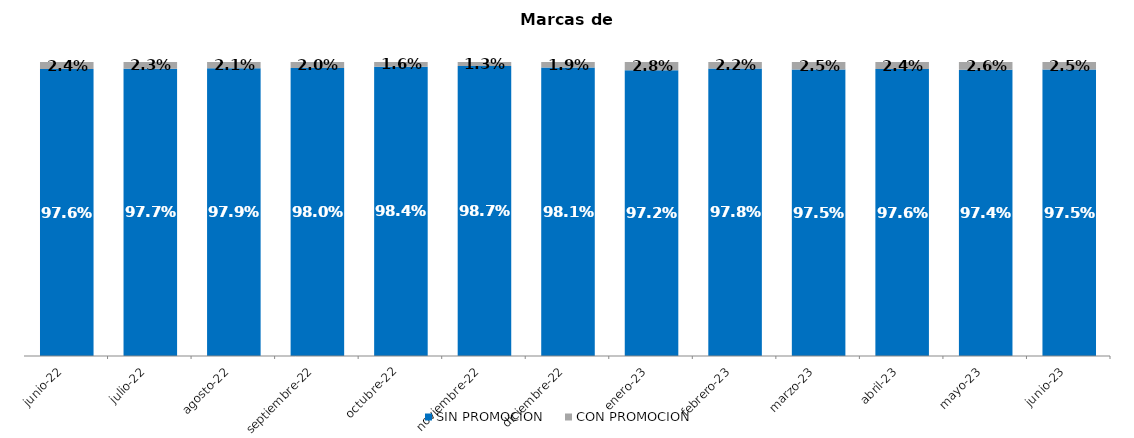
| Category | SIN PROMOCION   | CON PROMOCION   |
|---|---|---|
| 2022-06-01 | 0.976 | 0.024 |
| 2022-07-01 | 0.977 | 0.023 |
| 2022-08-01 | 0.979 | 0.021 |
| 2022-09-01 | 0.98 | 0.02 |
| 2022-10-01 | 0.984 | 0.016 |
| 2022-11-01 | 0.987 | 0.013 |
| 2022-12-01 | 0.981 | 0.019 |
| 2023-01-01 | 0.972 | 0.028 |
| 2023-02-01 | 0.978 | 0.022 |
| 2023-03-01 | 0.975 | 0.025 |
| 2023-04-01 | 0.976 | 0.024 |
| 2023-05-01 | 0.974 | 0.026 |
| 2023-06-01 | 0.975 | 0.025 |